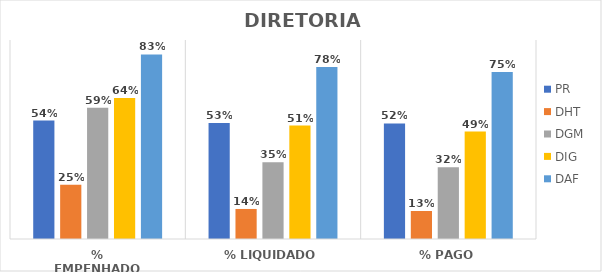
| Category | PR | DHT | DGM | DIG | DAF |
|---|---|---|---|---|---|
| % EMPENHADO | 0.536 | 0.245 | 0.594 | 0.638 | 0.835 |
| % LIQUIDADO | 0.525 | 0.136 | 0.348 | 0.513 | 0.778 |
| % PAGO | 0.523 | 0.127 | 0.325 | 0.486 | 0.755 |